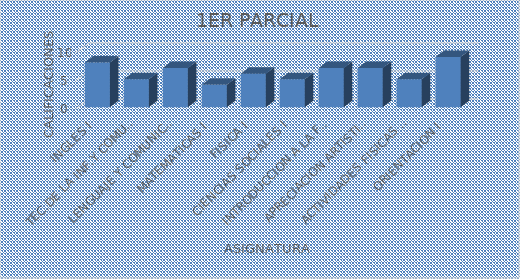
| Category | 1ER PARCIAL |
|---|---|
| INGLES I | 8 |
| TEC.DE LA INF.Y COMUNICACION I | 5 |
| LENGUAJE Y COMUNICACION I | 7 |
| MATEMATICAS I | 4 |
| FISICA I | 6 |
| CIENCIAS SOCIALES I | 5 |
| INTRODUCCION A LA FILOSOFIA | 7 |
| APRECIACION ARTISTICA I | 7 |
| ACTIVIDADES FISICAS Y DEPORTIVAS I | 5 |
| ORIENTACION I | 9 |